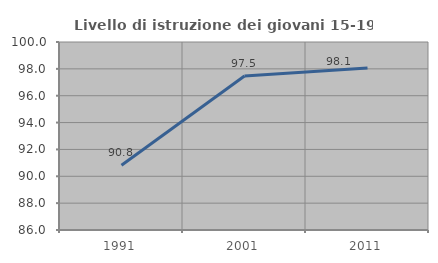
| Category | Livello di istruzione dei giovani 15-19 anni |
|---|---|
| 1991.0 | 90.826 |
| 2001.0 | 97.468 |
| 2011.0 | 98.063 |